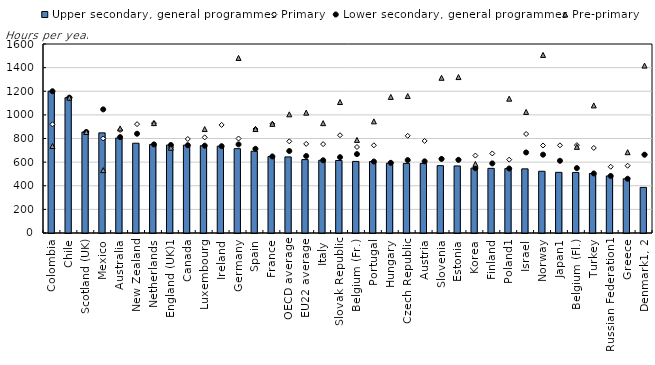
| Category | Upper secondary, general programmes |
|---|---|
| Colombia | 1200 |
| Chile | 1145.813 |
| Scotland (UK) | 855 |
| Mexico | 847.7 |
| Australia | 804.013 |
| New Zealand | 760 |
| Netherlands | 750 |
| England (UK)1 | 744.8 |
| Canada | 744 |
| Luxembourg | 739.2 |
| Ireland | 734.8 |
| Germany | 713.887 |
| Spain | 692.55 |
| France | 648 |
| OECD average | 644.011 |
| EU22 average | 621.556 |
| Italy | 615.6 |
| Slovak Republic | 613.8 |
| Belgium (Fr.) | 606.06 |
| Portugal | 605 |
| Hungary | 590.4 |
| Czech Republic | 589.05 |
| Austria | 588.6 |
| Slovenia | 570 |
| Estonia | 567.6 |
| Korea | 549.67 |
| Finland | 547.162 |
| Poland1 | 545 |
| Israel | 543.079 |
| Norway | 522.5 |
| Japan1 | 513.357 |
| Belgium (Fl.) | 512.677 |
| Turkey | 504 |
| Russian Federation1 | 483 |
| Greece | 459.04 |
| Denmark1, 2 | 386 |